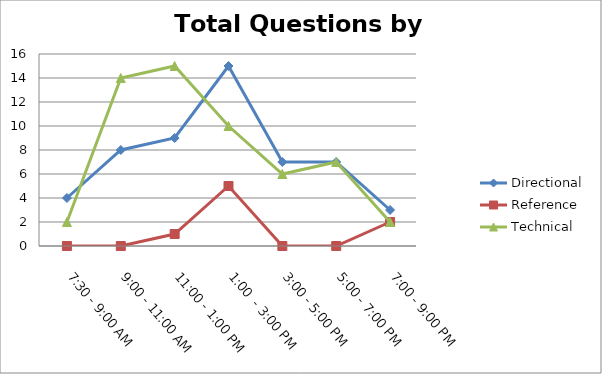
| Category | Directional | Reference | Technical |
|---|---|---|---|
| 7:30 - 9:00 AM | 4 | 0 | 2 |
| 9:00 - 11:00 AM | 8 | 0 | 14 |
| 11:00 - 1:00 PM | 9 | 1 | 15 |
| 1:00  - 3:00 PM | 15 | 5 | 10 |
| 3:00 - 5:00 PM | 7 | 0 | 6 |
| 5:00 - 7:00 PM | 7 | 0 | 7 |
| 7:00 - 9:00 PM | 3 | 2 | 2 |